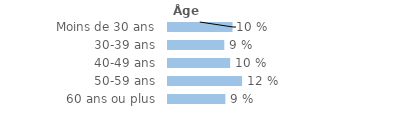
| Category | Series 0 |
|---|---|
| Moins de 30 ans | 0.102 |
| 30-39 ans | 0.089 |
| 40-49 ans | 0.099 |
| 50-59 ans | 0.118 |
| 60 ans ou plus | 0.091 |